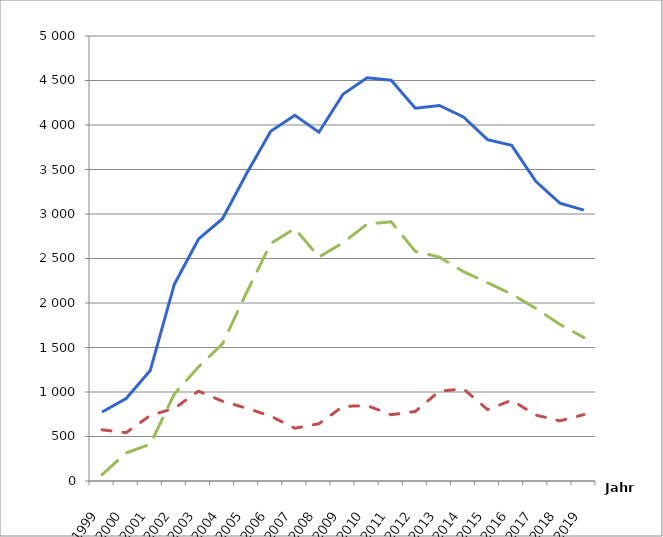
| Category | Series 0 | Series 1 | Series 2 |
|---|---|---|---|
| 1999.0 | 775 | 575 | 71 |
| 2000.0 | 926 | 543 | 316 |
| 2001.0 | 1241 | 737 | 413 |
| 2002.0 | 2211 | 816 | 978 |
| 2003.0 | 2717 | 1010 | 1281 |
| 2004.0 | 2947 | 896 | 1542 |
| 2005.0 | 3455 | 818 | 2119 |
| 2006.0 | 3929 | 729 | 2668 |
| 2007.0 | 4110 | 593 | 2837 |
| 2008.0 | 3919 | 643 | 2516 |
| 2009.0 | 4346 | 838 | 2677 |
| 2010.0 | 4530 | 847 | 2887 |
| 2011.0 | 4503 | 745 | 2912 |
| 2012.0 | 4188 | 781 | 2581 |
| 2013.0 | 4220 | 1009 | 2516 |
| 2014.0 | 4091 | 1035 | 2352 |
| 2015.0 | 3835 | 802 | 2228 |
| 2016.0 | 3772 | 907 | 2099 |
| 2017.0 | 3367 | 741 | 1939 |
| 2018.0 | 3122 | 676 | 1760 |
| 2019.0 | 3044 | 746 | 1612 |